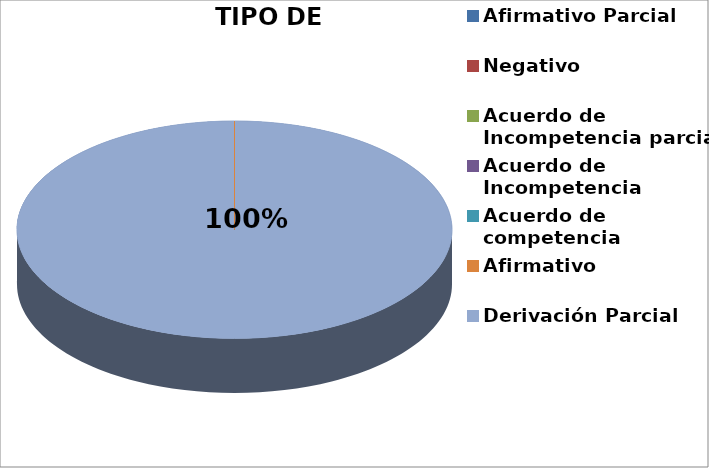
| Category | Series 0 |
|---|---|
| Afirmativo Parcial | 0 |
| Negativo | 0 |
| Acuerdo de Incompetencia parcial | 0 |
| Acuerdo de Incompetencia | 0 |
| Acuerdo de competencia | 0 |
| Afirmativo | 0 |
| Derivación Parcial | 1 |